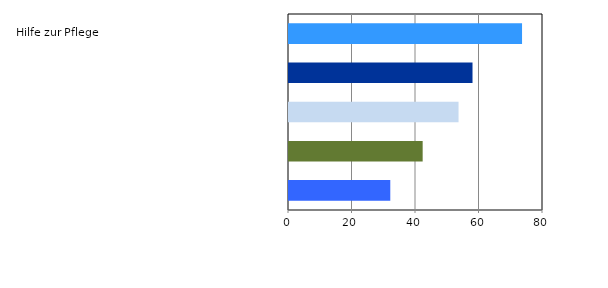
| Category | Series 0 |
|---|---|
| Eingliederungshilfe | 31.9 |
| Leistungen insgesamt | 42.1 |
| Hilfe z.Überw. Bes.Schwierigk. | 53.4 |
| Hilfe z. Gesundheit | 57.8 |
| Hilfe zur Pflege | 73.4 |